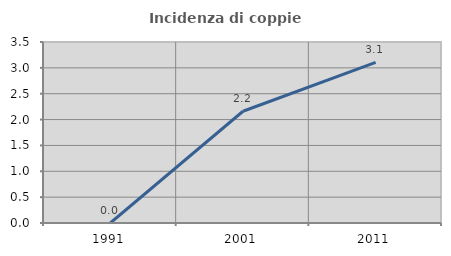
| Category | Incidenza di coppie miste |
|---|---|
| 1991.0 | 0 |
| 2001.0 | 2.16 |
| 2011.0 | 3.107 |